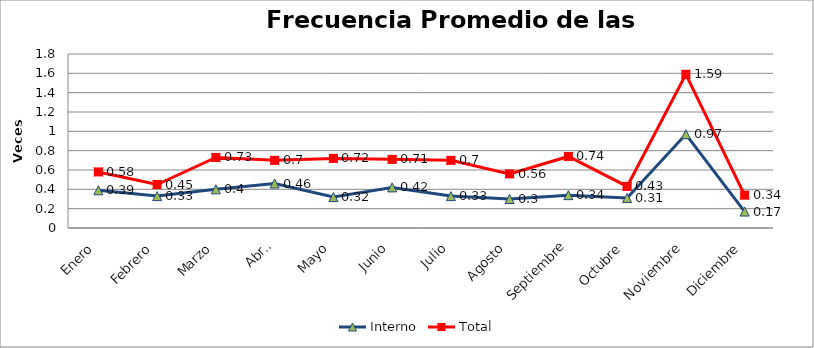
| Category | Interno | Total |
|---|---|---|
| Enero | 0.39 | 0.58 |
| Febrero | 0.33 | 0.45 |
| Marzo | 0.4 | 0.73 |
| Abril | 0.46 | 0.7 |
| Mayo | 0.32 | 0.72 |
| Junio | 0.42 | 0.71 |
| Julio | 0.33 | 0.7 |
| Agosto | 0.3 | 0.56 |
| Septiembre | 0.34 | 0.74 |
| Octubre | 0.31 | 0.43 |
| Noviembre | 0.97 | 1.59 |
| Diciembre | 0.17 | 0.34 |